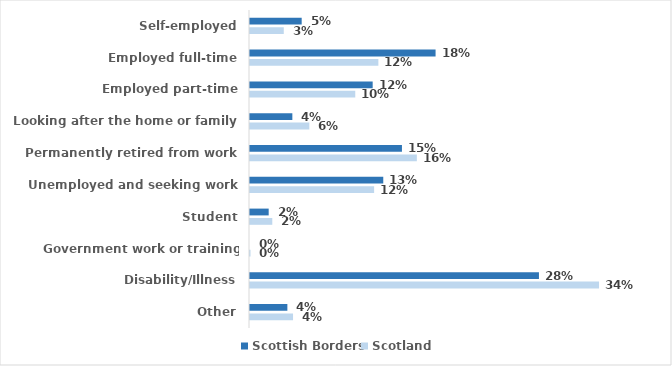
| Category | Scottish Borders | Scotland |
|---|---|---|
| Self-employed | 0.05 | 0.033 |
| Employed full-time | 0.18 | 0.124 |
| Employed part-time | 0.119 | 0.102 |
| Looking after the home or family | 0.041 | 0.057 |
| Permanently retired from work | 0.147 | 0.162 |
| Unemployed and seeking work | 0.129 | 0.12 |
| Student | 0.018 | 0.022 |
| Government work or training scheme | 0 | 0 |
| Disability/Illness | 0.28 | 0.338 |
| Other | 0.036 | 0.042 |